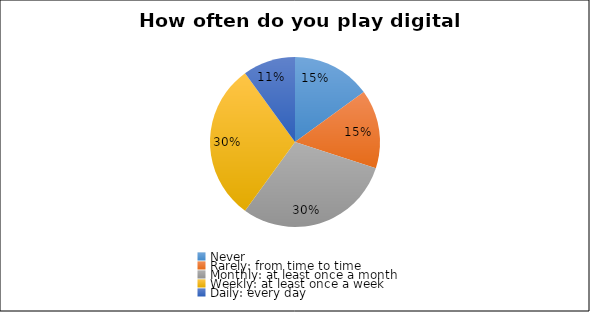
| Category | Series 0 |
|---|---|
| Never | 3 |
| Rarely: from time to time | 3 |
| Monthly: at least once a month | 6 |
| Weekly: at least once a week | 6 |
| Daily: every day | 2 |